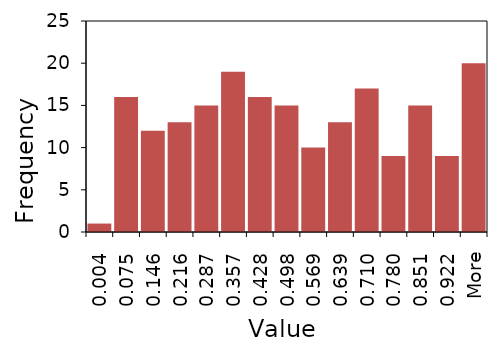
| Category | Series 1 |
|---|---|
| 0.004 | 1 |
| 0.075 | 16 |
| 0.146 | 12 |
| 0.216 | 13 |
| 0.287 | 15 |
| 0.357 | 19 |
| 0.428 | 16 |
| 0.498 | 15 |
| 0.569 | 10 |
| 0.639 | 13 |
| 0.710 | 17 |
| 0.780 | 9 |
| 0.851 | 15 |
| 0.922 | 9 |
| More | 20 |